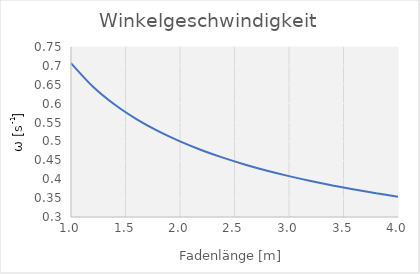
| Category | Series 0 |
|---|---|
| 1.0 | 0.707 |
| 1.2 | 0.645 |
| 1.4 | 0.598 |
| 1.6 | 0.559 |
| 1.8 | 0.527 |
| 2.0 | 0.5 |
| 2.2 | 0.477 |
| 2.4 | 0.456 |
| 2.6 | 0.439 |
| 2.8 | 0.423 |
| 3.0 | 0.408 |
| 3.2 | 0.395 |
| 3.4 | 0.383 |
| 3.6 | 0.373 |
| 3.8 | 0.363 |
| 4.0 | 0.354 |